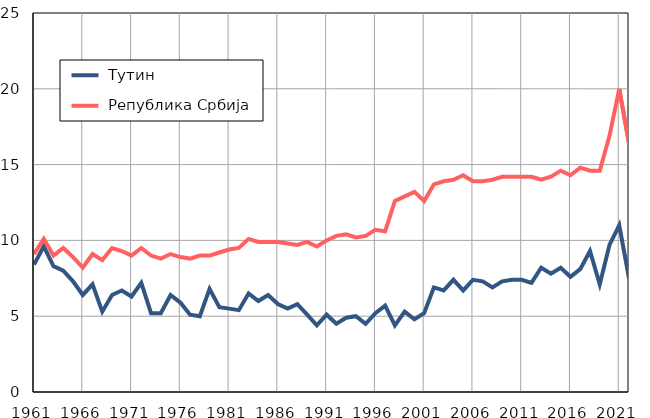
| Category |  Тутин |  Република Србија |
|---|---|---|
| 1961.0 | 8.4 | 9.1 |
| 1962.0 | 9.6 | 10.1 |
| 1963.0 | 8.3 | 9 |
| 1964.0 | 8 | 9.5 |
| 1965.0 | 7.3 | 8.9 |
| 1966.0 | 6.4 | 8.2 |
| 1967.0 | 7.1 | 9.1 |
| 1968.0 | 5.3 | 8.7 |
| 1969.0 | 6.4 | 9.5 |
| 1970.0 | 6.7 | 9.3 |
| 1971.0 | 6.3 | 9 |
| 1972.0 | 7.2 | 9.5 |
| 1973.0 | 5.2 | 9 |
| 1974.0 | 5.2 | 8.8 |
| 1975.0 | 6.4 | 9.1 |
| 1976.0 | 5.9 | 8.9 |
| 1977.0 | 5.1 | 8.8 |
| 1978.0 | 5 | 9 |
| 1979.0 | 6.8 | 9 |
| 1980.0 | 5.6 | 9.2 |
| 1981.0 | 5.5 | 9.4 |
| 1982.0 | 5.4 | 9.5 |
| 1983.0 | 6.5 | 10.1 |
| 1984.0 | 6 | 9.9 |
| 1985.0 | 6.4 | 9.9 |
| 1986.0 | 5.8 | 9.9 |
| 1987.0 | 5.5 | 9.8 |
| 1988.0 | 5.8 | 9.7 |
| 1989.0 | 5.1 | 9.9 |
| 1990.0 | 4.4 | 9.6 |
| 1991.0 | 5.1 | 10 |
| 1992.0 | 4.5 | 10.3 |
| 1993.0 | 4.9 | 10.4 |
| 1994.0 | 5 | 10.2 |
| 1995.0 | 4.5 | 10.3 |
| 1996.0 | 5.2 | 10.7 |
| 1997.0 | 5.7 | 10.6 |
| 1998.0 | 4.4 | 12.6 |
| 1999.0 | 5.3 | 12.9 |
| 2000.0 | 4.8 | 13.2 |
| 2001.0 | 5.2 | 12.6 |
| 2002.0 | 6.9 | 13.7 |
| 2003.0 | 6.7 | 13.9 |
| 2004.0 | 7.4 | 14 |
| 2005.0 | 6.7 | 14.3 |
| 2006.0 | 7.4 | 13.9 |
| 2007.0 | 7.3 | 13.9 |
| 2008.0 | 6.9 | 14 |
| 2009.0 | 7.3 | 14.2 |
| 2010.0 | 7.4 | 14.2 |
| 2011.0 | 7.4 | 14.2 |
| 2012.0 | 7.2 | 14.2 |
| 2013.0 | 8.2 | 14 |
| 2014.0 | 7.8 | 14.2 |
| 2015.0 | 8.2 | 14.6 |
| 2016.0 | 7.6 | 14.3 |
| 2017.0 | 8.1 | 14.8 |
| 2018.0 | 9.3 | 14.6 |
| 2019.0 | 7.1 | 14.6 |
| 2020.0 | 9.7 | 16.9 |
| 2021.0 | 11 | 20 |
| 2022.0 | 7.5 | 16.4 |